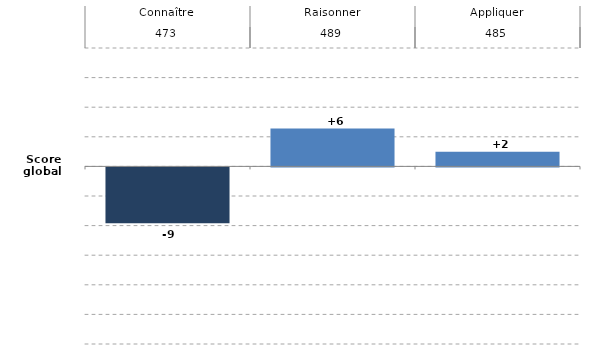
| Category | Series 0 |
|---|---|
| 0 | -9.447 |
| 1 | 6.394 |
| 2 | 2.483 |